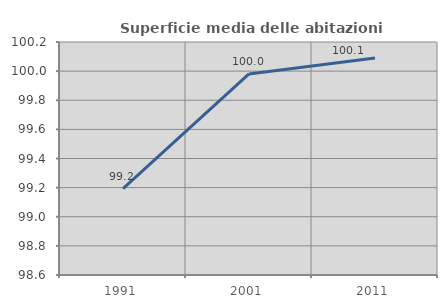
| Category | Superficie media delle abitazioni occupate |
|---|---|
| 1991.0 | 99.193 |
| 2001.0 | 99.98 |
| 2011.0 | 100.089 |